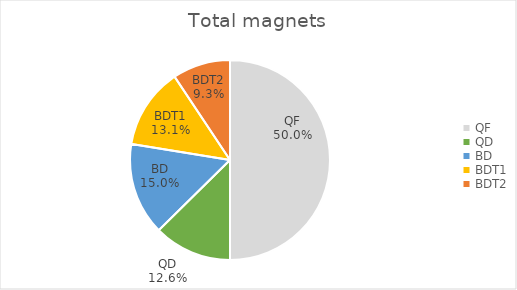
| Category | Total magnets |
|---|---|
| QF | 107 |
| QD | 27 |
| BD | 32 |
| BDT1 | 28 |
| BDT2 | 20 |